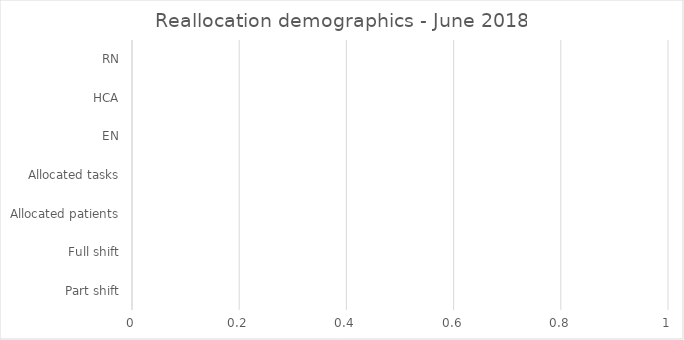
| Category | Number |
|---|---|
| Part shift | 0 |
| Full shift | 0 |
| Allocated patients | 0 |
| Allocated tasks | 0 |
| EN | 0 |
| HCA | 0 |
| RN | 0 |